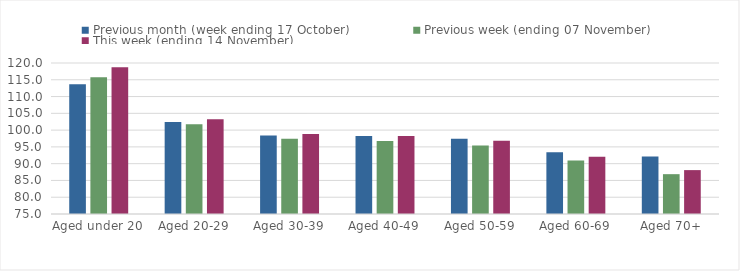
| Category | Previous month (week ending 17 October) | Previous week (ending 07 November) | This week (ending 14 November) |
|---|---|---|---|
| Aged under 20 | 113.68 | 115.79 | 118.72 |
| Aged 20-29 | 102.43 | 101.78 | 103.26 |
| Aged 30-39 | 98.4 | 97.42 | 98.81 |
| Aged 40-49 | 98.25 | 96.75 | 98.23 |
| Aged 50-59 | 97.44 | 95.44 | 96.85 |
| Aged 60-69 | 93.38 | 90.91 | 92.07 |
| Aged 70+ | 92.17 | 86.87 | 88.08 |